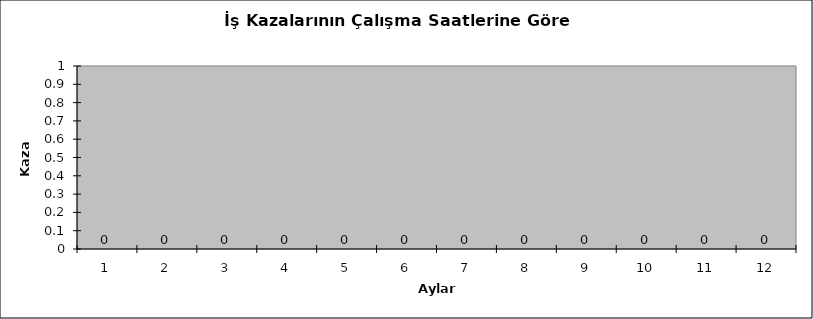
| Category | Series 1 |
|---|---|
| 0 | 0 |
| 1 | 0 |
| 2 | 0 |
| 3 | 0 |
| 4 | 0 |
| 5 | 0 |
| 6 | 0 |
| 7 | 0 |
| 8 | 0 |
| 9 | 0 |
| 10 | 0 |
| 11 | 0 |